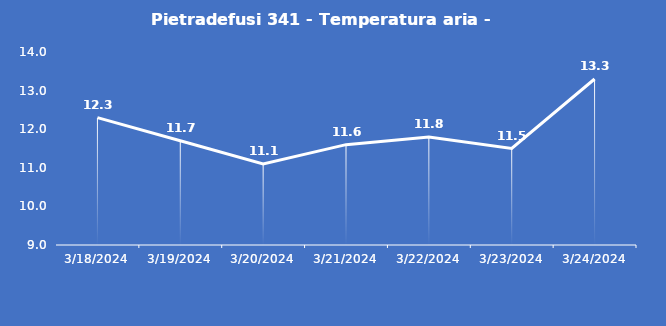
| Category | Pietradefusi 341 - Temperatura aria - Grezzo (°C) |
|---|---|
| 3/18/24 | 12.3 |
| 3/19/24 | 11.7 |
| 3/20/24 | 11.1 |
| 3/21/24 | 11.6 |
| 3/22/24 | 11.8 |
| 3/23/24 | 11.5 |
| 3/24/24 | 13.3 |